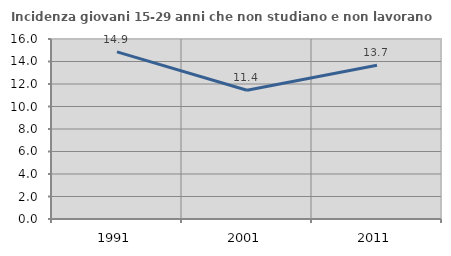
| Category | Incidenza giovani 15-29 anni che non studiano e non lavorano  |
|---|---|
| 1991.0 | 14.85 |
| 2001.0 | 11.447 |
| 2011.0 | 13.662 |